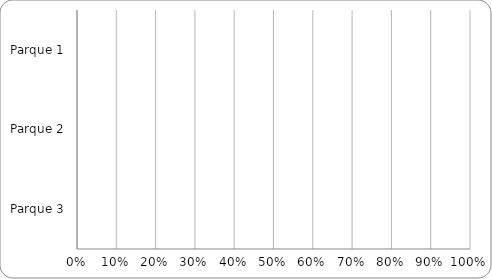
| Category | Porcentaje de cumplimiento de Indicadores obligatorios primarios |
|---|---|
| Parque 1 | 0 |
| Parque 2 | 0 |
| Parque 3 | 0 |